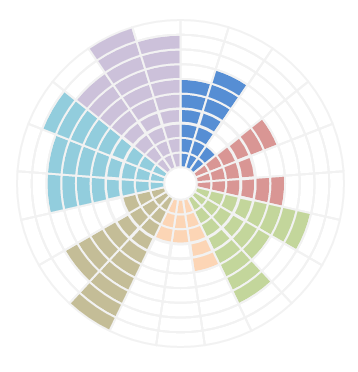
| Category | Series 0 | Series 1 | Series 2 | Series 3 | Series 4 | Series 5 | Series 6 | Series 7 | Series 8 | Series 9 |
|---|---|---|---|---|---|---|---|---|---|---|
| 0 | 10 | 10 | 10 | 10 | 10 | 10 | 0 | 0 | 0 | 0 |
| 1 | 0 | 0 | 0 | 0 | 0 | 0 | 10 | 10 | 10 | 10 |
| 2 | 10 | 10 | 10 | 10 | 10 | 10 | 10 | 0 | 0 | 0 |
| 3 | 0 | 0 | 0 | 0 | 0 | 0 | 0 | 10 | 10 | 10 |
| 4 | 10 | 10 | 0 | 0 | 0 | 0 | 0 | 0 | 0 | 0 |
| 5 | 0 | 0 | 10 | 10 | 10 | 10 | 10 | 10 | 10 | 10 |
| 6 | 10 | 10 | 10 | 10 | 10 | 10 | 0 | 0 | 0 | 0 |
| 7 | 0 | 0 | 0 | 0 | 0 | 0 | 10 | 10 | 10 | 10 |
| 8 | 10 | 10 | 10 | 10 | 0 | 0 | 0 | 0 | 0 | 0 |
| 9 | 0 | 0 | 0 | 0 | 10 | 10 | 10 | 10 | 10 | 10 |
| 10 | 10 | 10 | 10 | 10 | 10 | 10 | 0 | 0 | 0 | 0 |
| 11 | 0 | 0 | 0 | 0 | 0 | 0 | 10 | 10 | 10 | 10 |
| 12 | 10 | 10 | 10 | 10 | 10 | 10 | 10 | 10 | 0 | 0 |
| 13 | 0 | 0 | 0 | 0 | 0 | 0 | 0 | 0 | 10 | 10 |
| 14 | 10 | 10 | 10 | 10 | 10 | 10 | 0 | 0 | 0 | 0 |
| 15 | 0 | 0 | 0 | 0 | 0 | 0 | 10 | 10 | 10 | 10 |
| 16 | 10 | 10 | 10 | 10 | 10 | 10 | 10 | 10 | 0 | 0 |
| 17 | 0 | 0 | 0 | 0 | 0 | 0 | 0 | 0 | 10 | 10 |
| 18 | 10 | 10 | 10 | 10 | 10 | 0 | 0 | 0 | 0 | 0 |
| 19 | 0 | 0 | 0 | 0 | 0 | 10 | 10 | 10 | 10 | 10 |
| 20 | 10 | 10 | 10 | 0 | 0 | 0 | 0 | 0 | 0 | 0 |
| 21 | 0 | 0 | 0 | 10 | 10 | 10 | 10 | 10 | 10 | 10 |
| 22 | 10 | 10 | 10 | 0 | 0 | 0 | 0 | 0 | 0 | 0 |
| 23 | 0 | 0 | 0 | 10 | 10 | 10 | 10 | 10 | 10 | 10 |
| 24 | 10 | 10 | 10 | 10 | 10 | 10 | 10 | 10 | 10 | 10 |
| 25 | 0 | 0 | 0 | 0 | 0 | 0 | 0 | 0 | 0 | 0 |
| 26 | 10 | 10 | 10 | 10 | 10 | 10 | 10 | 10 | 0 | 0 |
| 27 | 0 | 0 | 0 | 0 | 0 | 0 | 0 | 0 | 10 | 10 |
| 28 | 10 | 10 | 10 | 0 | 0 | 0 | 0 | 0 | 0 | 0 |
| 29 | 0 | 0 | 0 | 10 | 10 | 10 | 10 | 10 | 10 | 10 |
| 30 | 10 | 10 | 10 | 10 | 10 | 10 | 10 | 10 | 0 | 0 |
| 31 | 0 | 0 | 0 | 0 | 0 | 0 | 0 | 0 | 10 | 10 |
| 32 | 10 | 10 | 10 | 10 | 10 | 10 | 10 | 10 | 0 | 0 |
| 33 | 0 | 0 | 0 | 0 | 0 | 0 | 0 | 0 | 10 | 10 |
| 34 | 10 | 10 | 10 | 10 | 10 | 10 | 10 | 10 | 10 | 0 |
| 35 | 0 | 0 | 0 | 0 | 0 | 0 | 0 | 0 | 0 | 10 |
| 36 | 10 | 10 | 10 | 10 | 10 | 10 | 10 | 10 | 0 | 0 |
| 37 | 0 | 0 | 0 | 0 | 0 | 0 | 0 | 0 | 10 | 10 |
| 38 | 10 | 10 | 10 | 10 | 10 | 10 | 10 | 10 | 10 | 10 |
| 39 | 0 | 0 | 0 | 0 | 0 | 0 | 0 | 0 | 0 | 0 |
| 40 | 10 | 10 | 10 | 10 | 10 | 10 | 10 | 10 | 10 | 0 |
| 41 | 0 | 0 | 0 | 0 | 0 | 0 | 0 | 0 | 0 | 10 |